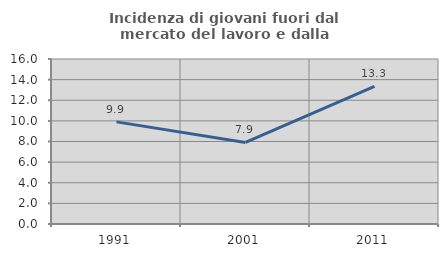
| Category | Incidenza di giovani fuori dal mercato del lavoro e dalla formazione  |
|---|---|
| 1991.0 | 9.903 |
| 2001.0 | 7.906 |
| 2011.0 | 13.347 |